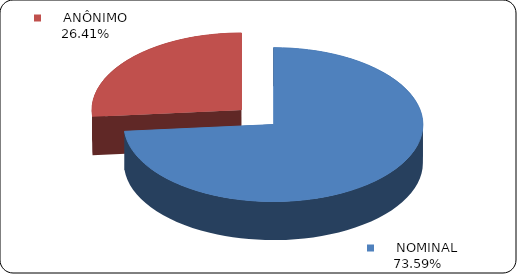
| Category | Series 0 |
|---|---|
|      NOMINAL | 0.736 |
|      ANÔNIMO | 0.264 |